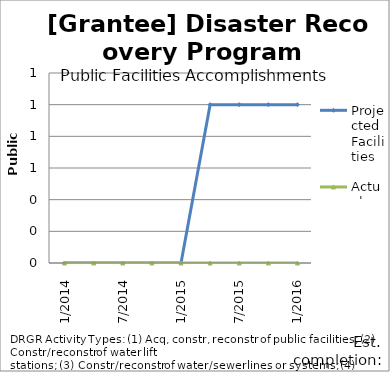
| Category | Projected Facilities | Actual Facilities |
|---|---|---|
| 1/2014 | 0 | 0 |
| 4/2014 | 0 | 0 |
| 7/2014 | 0 | 0 |
| 10/2014 | 0 | 0 |
| 1/2015 | 0 | 0 |
| 4/2015 | 1 | 0 |
| 7/2015 | 1 | 0 |
| 10/2015 | 1 | 0 |
| 1/2016 | 1 | 0 |